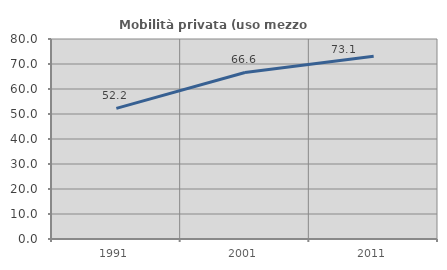
| Category | Mobilità privata (uso mezzo privato) |
|---|---|
| 1991.0 | 52.239 |
| 2001.0 | 66.617 |
| 2011.0 | 73.104 |